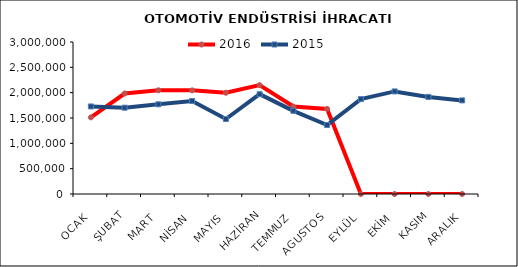
| Category | 2016 | 2015 |
|---|---|---|
| OCAK | 1512341.764 | 1728185.638 |
| ŞUBAT | 1983150.772 | 1703279.75 |
| MART | 2046716.707 | 1770417.738 |
| NİSAN | 2045838.752 | 1835673.643 |
| MAYIS | 1998571.345 | 1480106.151 |
| HAZİRAN | 2148352.721 | 1969904.471 |
| TEMMUZ | 1725976.288 | 1641980.428 |
| AGUSTOS | 1679795.161 | 1361396.461 |
| EYLÜL | 0 | 1872658.866 |
| EKİM | 0 | 2024758.081 |
| KASIM | 0 | 1916069.228 |
| ARALIK | 0 | 1847544.528 |